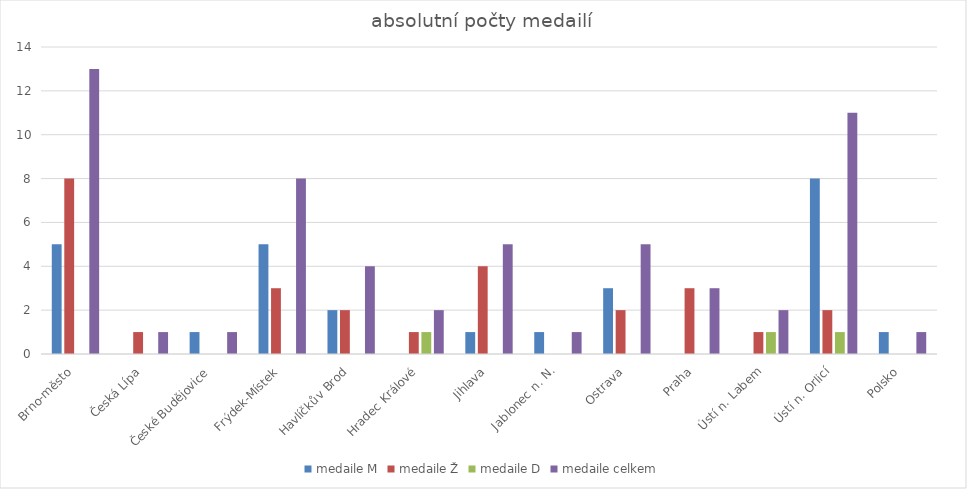
| Category | medaile M | medaile Ž | medaile D | medaile celkem |
|---|---|---|---|---|
| Brno-město | 5 | 8 | 0 | 13 |
| Česká Lípa | 0 | 1 | 0 | 1 |
| České Budějovice | 1 | 0 | 0 | 1 |
| Frýdek-Místek | 5 | 3 | 0 | 8 |
| Havlíčkův Brod | 2 | 2 | 0 | 4 |
| Hradec Králové | 0 | 1 | 1 | 2 |
| Jihlava | 1 | 4 | 0 | 5 |
| Jablonec n. N. | 1 | 0 | 0 | 1 |
| Ostrava | 3 | 2 | 0 | 5 |
| Praha | 0 | 3 | 0 | 3 |
| Ústí n. Labem | 0 | 1 | 1 | 2 |
| Ústí n. Orlicí | 8 | 2 | 1 | 11 |
| Polsko | 1 | 0 | 0 | 1 |